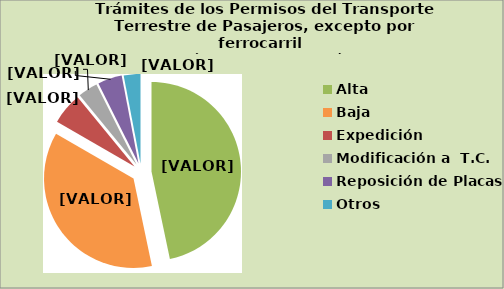
| Category | Series 0 |
|---|---|
| Alta                                         | 46.703 |
| Baja | 36.638 |
| Expedición | 5.705 |
| Modificación a  T.C. | 3.566 |
| Reposición de Placas | 4.372 |
| Otros | 3.016 |